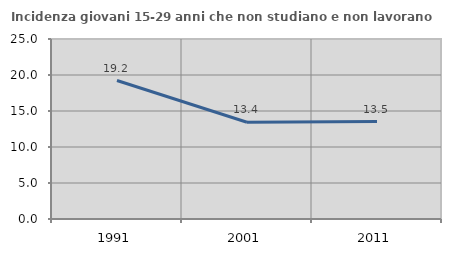
| Category | Incidenza giovani 15-29 anni che non studiano e non lavorano  |
|---|---|
| 1991.0 | 19.231 |
| 2001.0 | 13.443 |
| 2011.0 | 13.542 |